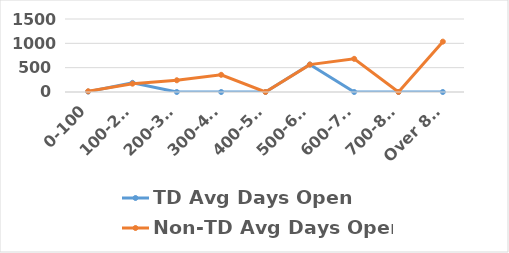
| Category | TD Avg Days Open  | Non-TD Avg Days Open  |
|---|---|---|
| 0-100 | 8.219 | 14.963 |
| 100-200 | 188.523 | 171.149 |
| 200-300 | 0 | 241.07 |
| 300-400 | 0 | 352.95 |
| 400-500 | 0 | 0 |
| 500-600 | 565.298 | 563.014 |
| 600-700 | 0 | 681.565 |
| 700-800 | 0 | 0 |
| Over 800 | 0 | 1034.717 |